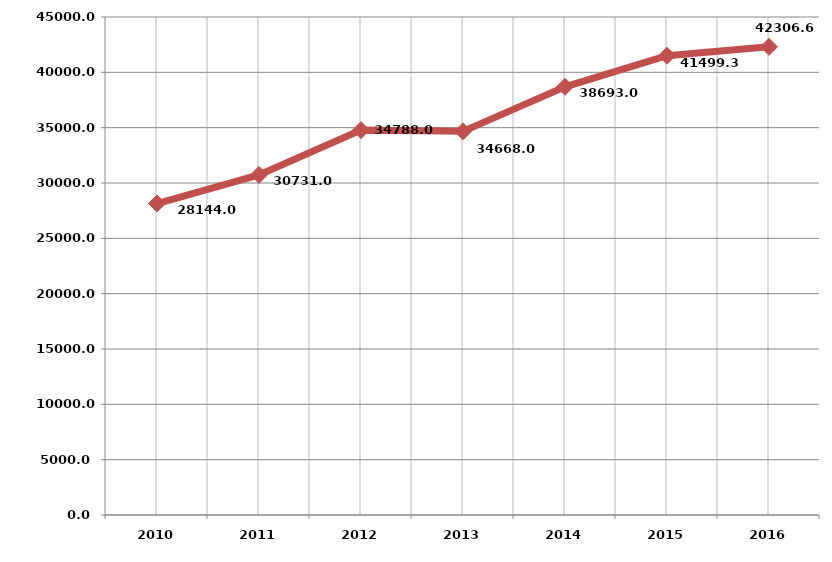
| Category | الطاقة المولــــدة
 [جبجا واط . ساعة) Generation (GWH) |
|---|---|
| 2010.0 | 28144 |
| 2011.0 | 30731 |
| 2012.0 | 34788 |
| 2013.0 | 34668 |
| 2014.0 | 38693 |
| 2015.0 | 41499.3 |
| 2016.0 | 42306.6 |